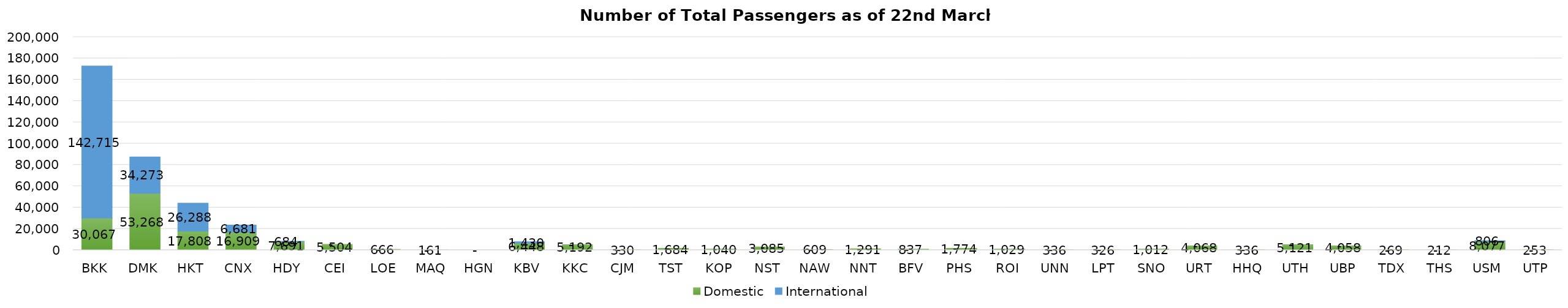
| Category | Domestic | International |
|---|---|---|
| BKK | 30067 | 142715 |
| DMK | 53268 | 34273 |
| HKT | 17808 | 26288 |
| CNX | 16909 | 6681 |
| HDY | 7691 | 684 |
| CEI | 5504 | 0 |
| LOE | 666 | 0 |
| MAQ | 161 | 0 |
| HGN | 0 | 0 |
| KBV | 6448 | 1430 |
| KKC | 5192 | 0 |
| CJM | 330 | 0 |
| TST | 1684 | 0 |
| KOP | 1040 | 0 |
| NST | 3085 | 0 |
| NAW | 609 | 0 |
| NNT | 1291 | 0 |
| BFV | 837 | 0 |
| PHS | 1774 | 0 |
| ROI | 1029 | 0 |
| UNN | 336 | 0 |
| LPT | 326 | 0 |
| SNO | 1012 | 0 |
| URT | 4068 | 0 |
| HHQ | 336 | 0 |
| UTH | 5121 | 0 |
| UBP | 4058 | 0 |
| TDX | 269 | 0 |
| THS | 212 | 0 |
| USM | 8077 | 806 |
| UTP | 253 | 0 |